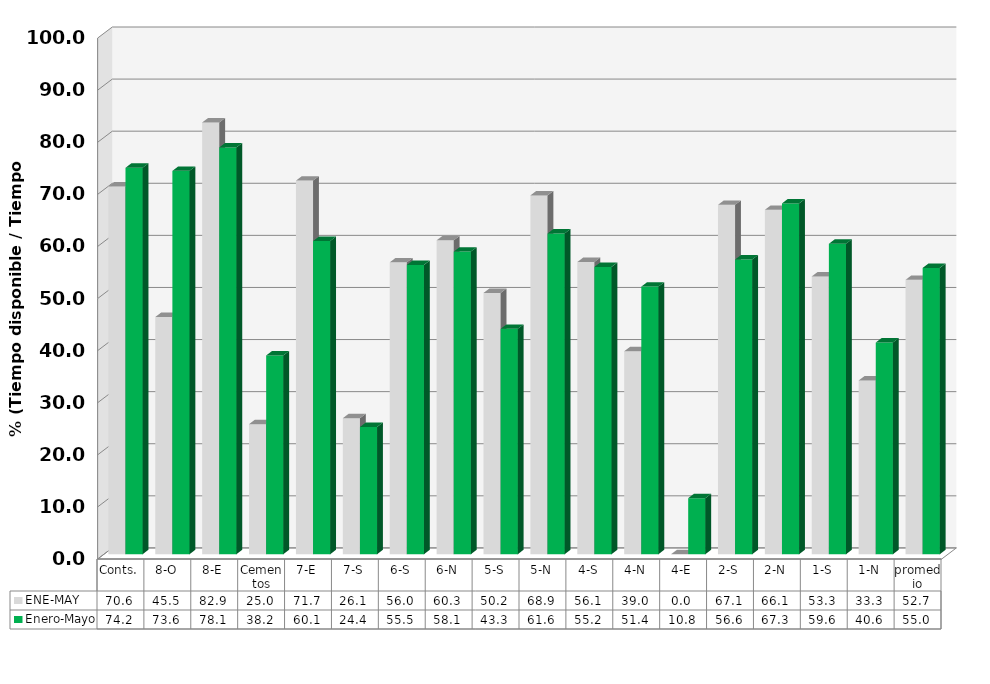
| Category | ENE-MAY | Enero-Mayo |
|---|---|---|
| Conts. | 70.598 | 74.188 |
| 8-O | 45.539 | 73.594 |
| 8-E | 82.879 | 78.09 |
| Cementos | 24.971 | 38.158 |
| 7-E | 71.719 | 60.118 |
| 7-S | 26.115 | 24.427 |
| 6-S | 56.032 | 55.541 |
| 6-N | 60.259 | 58.09 |
| 5-S | 50.153 | 43.267 |
| 5-N | 68.884 | 61.569 |
| 4-S | 56.09 | 55.157 |
| 4-N | 38.962 | 51.375 |
| 4-E | 0 | 10.763 |
| 2-S | 67.066 | 56.575 |
| 2-N | 66.111 | 67.347 |
| 1-S | 53.327 | 59.595 |
| 1-N | 33.35 | 40.646 |
| promedio | 52.673 | 54.963 |